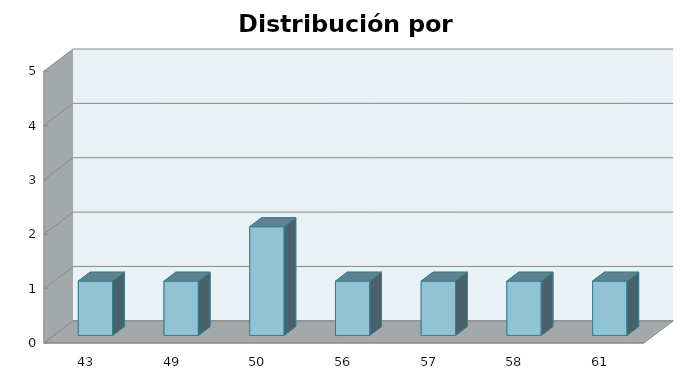
| Category | Series 1 |
|---|---|
| 43.0 | 1 |
| 49.0 | 1 |
| 50.0 | 2 |
| 56.0 | 1 |
| 57.0 | 1 |
| 58.0 | 1 |
| 61.0 | 1 |